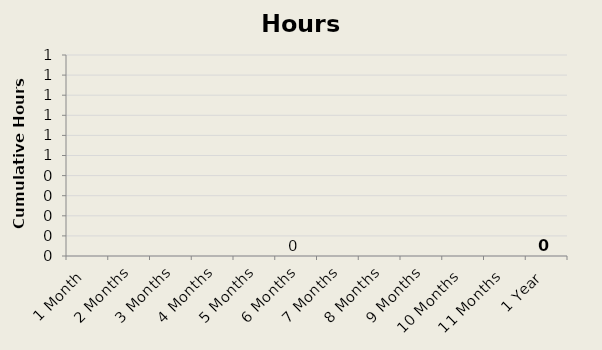
| Category | Hours Saved |
|---|---|
| 1 Month | 0 |
| 2 Months | 0 |
| 3 Months | 0 |
| 4 Months | 0 |
| 5 Months | 0 |
| 6 Months | 0 |
| 7 Months | 0 |
| 8 Months | 0 |
| 9 Months | 0 |
| 10 Months | 0 |
| 11 Months | 0 |
| 1 Year | 0 |